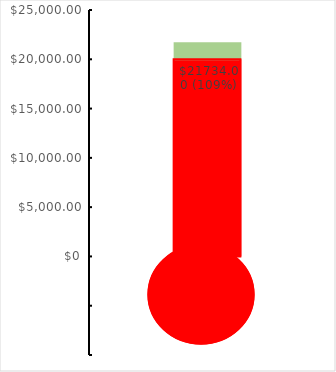
| Category | Series 1 | Series 2 |
|---|---|---|
| 0 | 20000 | 1734 |